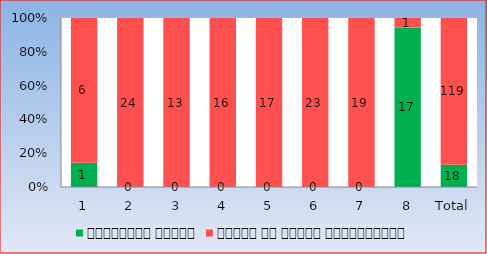
| Category | गृहकार्य संकलन | संकलन से वंचित विद्यार्थी |
|---|---|---|
| 1 | 1 | 6 |
| 2 | 0 | 24 |
| 3 | 0 | 13 |
| 4 | 0 | 16 |
| 5 | 0 | 17 |
| 6 | 0 | 23 |
| 7 | 0 | 19 |
| 8 | 17 | 1 |
| Total | 18 | 119 |